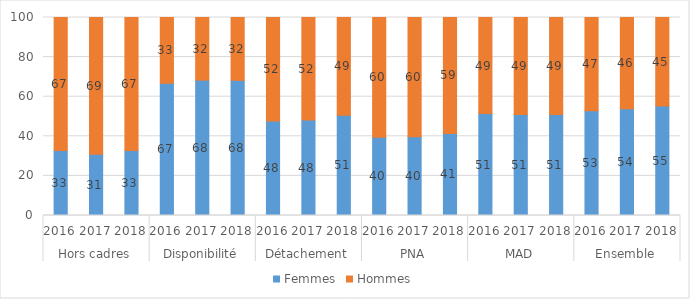
| Category | Femmes | Hommes |
|---|---|---|
| 0 | 32.864 | 67.136 |
| 1 | 30.986 | 69.014 |
| 2 | 32.787 | 67.213 |
| 3 | 66.819 | 33.181 |
| 4 | 68.368 | 31.632 |
| 5 | 68.253 | 31.747 |
| 6 | 47.787 | 52.213 |
| 7 | 48.241 | 51.759 |
| 8 | 50.593 | 49.407 |
| 9 | 39.508 | 60.492 |
| 10 | 39.754 | 60.246 |
| 11 | 41.439 | 58.561 |
| 12 | 51.485 | 48.515 |
| 13 | 51.026 | 48.974 |
| 14 | 51.056 | 48.944 |
| 15 | 52.85 | 47.15 |
| 16 | 53.877 | 46.123 |
| 17 | 55.31 | 44.69 |